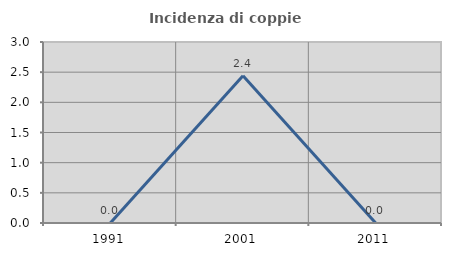
| Category | Incidenza di coppie miste |
|---|---|
| 1991.0 | 0 |
| 2001.0 | 2.439 |
| 2011.0 | 0 |